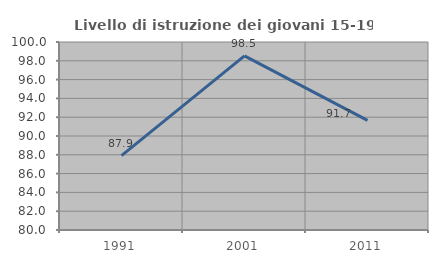
| Category | Livello di istruzione dei giovani 15-19 anni |
|---|---|
| 1991.0 | 87.912 |
| 2001.0 | 98.529 |
| 2011.0 | 91.667 |